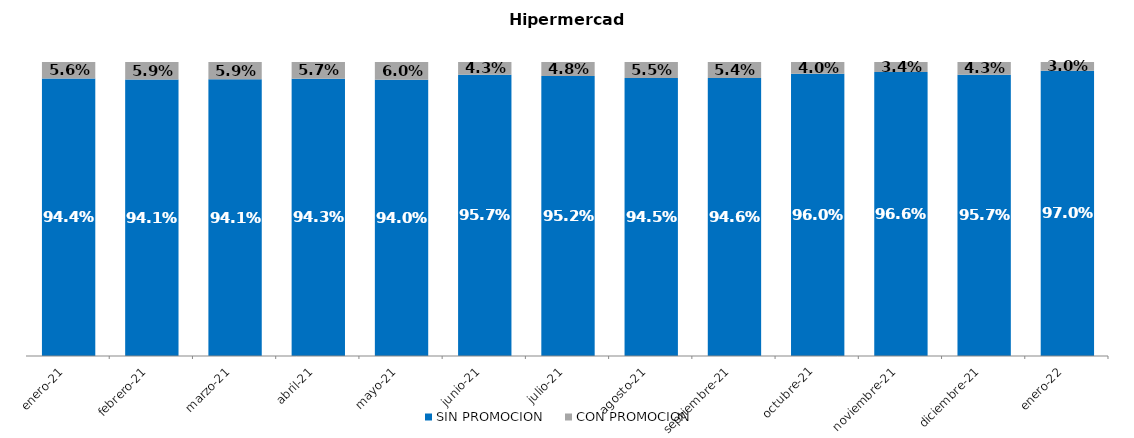
| Category | SIN PROMOCION   | CON PROMOCION   |
|---|---|---|
| 2021-01-01 | 0.944 | 0.056 |
| 2021-02-01 | 0.941 | 0.059 |
| 2021-03-01 | 0.941 | 0.059 |
| 2021-04-01 | 0.943 | 0.057 |
| 2021-05-01 | 0.94 | 0.06 |
| 2021-06-01 | 0.957 | 0.043 |
| 2021-07-01 | 0.952 | 0.048 |
| 2021-08-01 | 0.945 | 0.055 |
| 2021-09-01 | 0.946 | 0.054 |
| 2021-10-01 | 0.96 | 0.04 |
| 2021-11-01 | 0.966 | 0.034 |
| 2021-12-01 | 0.957 | 0.043 |
| 2022-01-01 | 0.97 | 0.03 |